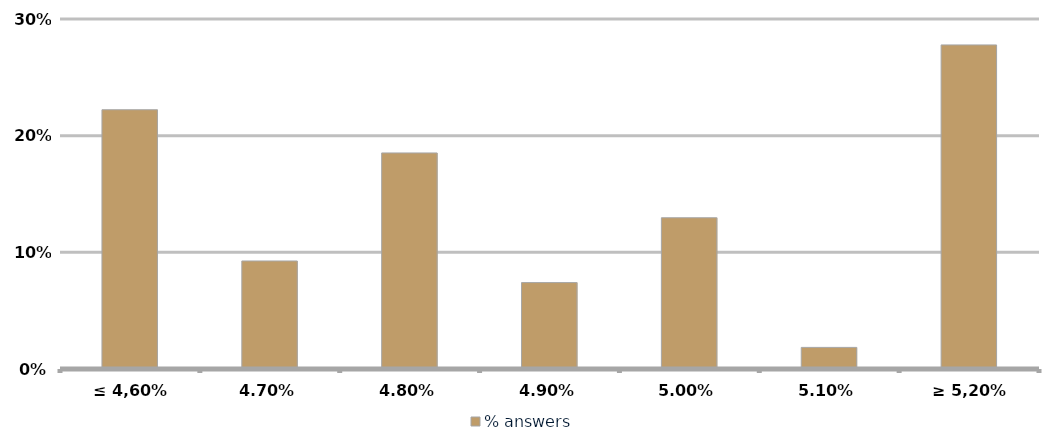
| Category | % answers |
|---|---|
| ≤ 4,60% | 0.222 |
| 4,70% | 0.093 |
| 4,80% | 0.185 |
| 4,90% | 0.074 |
| 5,00% | 0.13 |
| 5,10% | 0.019 |
| ≥ 5,20% | 0.278 |